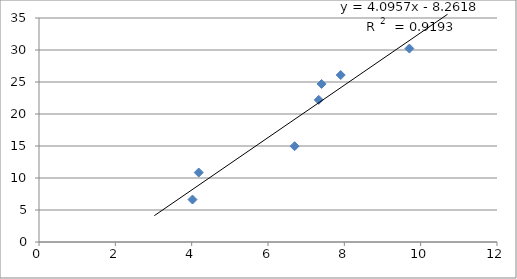
| Category | Series 0 |
|---|---|
| 7.905493191749866 | 26.09 |
| 7.403650587353038 | 24.695 |
| 4.18569390465281 | 10.857 |
| 4.021842038077702 | 6.634 |
| 9.703967422596666 | 30.225 |
| 7.329550730654005 | 22.204 |
| 6.696947846868643 | 14.972 |